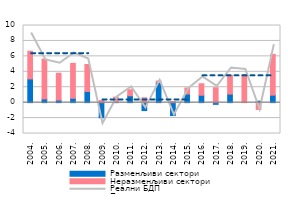
| Category | Разменљиви сектори | Неразменљиви сектори |
|---|---|---|
| 2004. | 3.075 | 3.59 |
| 2005. | 0.48 | 5.168 |
| 2006. | 0.333 | 3.479 |
| 2007. | 0.564 | 4.525 |
| 2008. | 1.448 | 3.495 |
| 2009. | -1.96 | 0.267 |
| 2010. | 0.025 | 0.69 |
| 2011. | 0.898 | 0.776 |
| 2012. | -1.029 | 0.633 |
| 2013. | 2.612 | 0.189 |
| 2014. | -1.674 | 0.137 |
| 2015. | 1.118 | 0.777 |
| 2016. | 0.957 | 1.493 |
| 2017. | -0.221 | 1.935 |
| 2018. | 1.111 | 2.446 |
| 2019. | 0 | 3.607 |
| 2020. | 0.192 | -0.882 |
| 2021. | 0.974 | 5.281 |